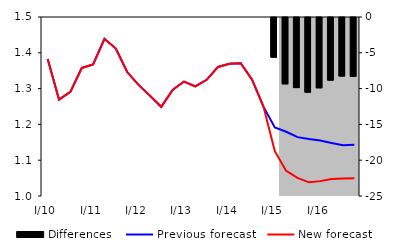
| Category | Differences |
|---|---|
| 0 | 0 |
| 1 | 0 |
| 2 | 0 |
| 3 | 0 |
| 4 | 0 |
| 5 | 0 |
| 6 | 0 |
| 7 | 0 |
| 8 | 0 |
| 9 | 0 |
| 10 | 0 |
| 11 | 0 |
| 12 | 0 |
| 13 | 0 |
| 14 | 0 |
| 15 | 0 |
| 16 | 0 |
| 17 | 0 |
| 18 | 0 |
| 19 | 0 |
| 20 | -5.541 |
| 21 | -9.266 |
| 22 | -9.789 |
| 23 | -10.424 |
| 24 | -9.817 |
| 25 | -8.747 |
| 26 | -8.174 |
| 27 | -8.219 |